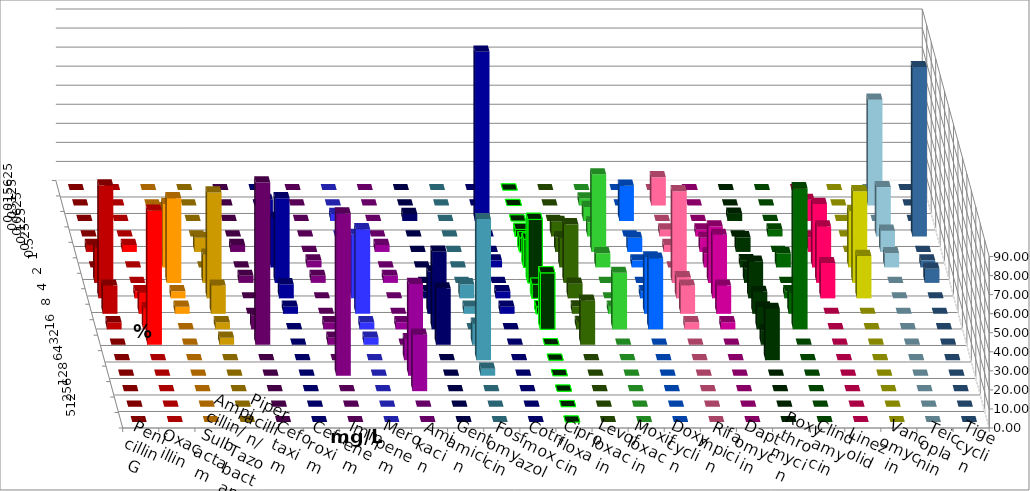
| Category | Penicillin G | Oxacillin | Ampicillin/ Sulbactam | Piperacillin/ Tazobactam | Cefotaxim | Cefuroxim | Imipenem | Meropenem | Amikacin | Gentamicin | Fosfomycin | Cotrimoxazol | Ciprofloxacin | Levofloxacin | Moxifloxacin | Doxycyclin | Rifampicin | Daptomycin | Roxythromycin | Clindamycin | Linezolid | Vancomycin | Teicoplanin | Tigecyclin |
|---|---|---|---|---|---|---|---|---|---|---|---|---|---|---|---|---|---|---|---|---|---|---|---|---|
| 0.015625 | 0 | 0 | 0 | 0 | 0 | 0 | 0 | 0 | 0 | 0 | 0 | 0 | 0 | 0 | 0 | 0 | 0 | 0 | 0 | 0 | 0 | 0 | 0 | 0 |
| 0.03125 | 0 | 0 | 0 | 0 | 0 | 0 | 0 | 0 | 0 | 0 | 0 | 0 | 0 | 0 | 3.704 | 0 | 14.815 | 0 | 0 | 0 | 0 | 0 | 0 | 55.556 |
| 0.0625 | 0 | 0 | 0 | 0 | 0 | 0 | 11.111 | 3.704 | 0 | 3.704 | 0 | 88.889 | 0 | 0 | 7.407 | 18.519 | 0 | 0 | 3.846 | 0 | 11.111 | 0 | 0 | 0 |
| 0.125 | 0 | 0 | 14.815 | 0 | 0 | 0 | 0 | 0 | 0 | 0 | 0 | 0 | 3.704 | 7.692 | 7.407 | 0 | 3.704 | 3.704 | 0 | 3.704 | 0 | 0 | 88.889 | 25.926 |
| 0.25 | 3.704 | 3.704 | 0 | 7.407 | 3.704 | 0 | 7.407 | 3.704 | 3.704 | 0 | 0 | 0 | 7.407 | 7.692 | 40.741 | 7.407 | 3.704 | 7.407 | 7.692 | 0 | 7.407 | 0 | 0 | 11.111 |
| 0.5 | 0 | 0 | 33.333 | 0 | 0 | 3.704 | 25.926 | 0 | 0 | 0 | 0 | 3.704 | 14.815 | 15.385 | 7.407 | 3.704 | 0 | 7.407 | 3.846 | 7.407 | 33.333 | 29.63 | 3.704 | 7.407 |
| 1.0 | 18.519 | 0 | 44.444 | 14.815 | 3.704 | 3.704 | 44.444 | 7.407 | 3.704 | 0 | 0 | 0 | 33.333 | 30.769 | 0 | 0 | 48.148 | 29.63 | 7.692 | 0 | 29.63 | 48.148 | 7.407 | 0 |
| 2.0 | 59.259 | 3.704 | 3.704 | 55.556 | 0 | 0 | 7.407 | 33.333 | 0 | 3.704 | 7.407 | 3.704 | 7.407 | 7.692 | 0 | 3.704 | 11.111 | 33.333 | 19.231 | 3.704 | 18.519 | 22.222 | 0 | 0 |
| 4.0 | 14.815 | 11.111 | 3.704 | 14.815 | 0 | 0 | 3.704 | 44.444 | 0 | 22.222 | 3.704 | 3.704 | 3.704 | 3.846 | 3.704 | 29.63 | 14.815 | 14.815 | 11.538 | 11.111 | 0 | 0 | 0 | 0 |
| 8.0 | 3.704 | 11.111 | 0 | 3.704 | 7.407 | 3.704 | 0 | 3.704 | 3.704 | 40.741 | 0 | 0 | 29.63 | 3.846 | 29.63 | 37.037 | 3.704 | 3.704 | 11.538 | 74.074 | 0 | 0 | 0 | 0 |
| 16.0 | 0 | 70.37 | 0 | 3.704 | 85.185 | 3.704 | 0 | 3.704 | 0 | 29.63 | 11.111 | 0 | 0 | 23.077 | 0 | 0 | 0 | 0 | 7.692 | 0 | 0 | 0 | 0 | 0 |
| 32.0 | 0 | 0 | 0 | 0 | 0 | 0 | 0 | 0 | 11.111 | 0 | 74.074 | 0 | 0 | 0 | 0 | 0 | 0 | 0 | 26.923 | 0 | 0 | 0 | 0 | 0 |
| 64.0 | 0 | 0 | 0 | 0 | 0 | 85.185 | 0 | 0 | 48.148 | 0 | 3.704 | 0 | 0 | 0 | 0 | 0 | 0 | 0 | 0 | 0 | 0 | 0 | 0 | 0 |
| 128.0 | 0 | 0 | 0 | 0 | 0 | 0 | 0 | 0 | 29.63 | 0 | 0 | 0 | 0 | 0 | 0 | 0 | 0 | 0 | 0 | 0 | 0 | 0 | 0 | 0 |
| 256.0 | 0 | 0 | 0 | 0 | 0 | 0 | 0 | 0 | 0 | 0 | 0 | 0 | 0 | 0 | 0 | 0 | 0 | 0 | 0 | 0 | 0 | 0 | 0 | 0 |
| 512.0 | 0 | 0 | 0 | 0 | 0 | 0 | 0 | 0 | 0 | 0 | 0 | 0 | 0 | 0 | 0 | 0 | 0 | 0 | 0 | 0 | 0 | 0 | 0 | 0 |